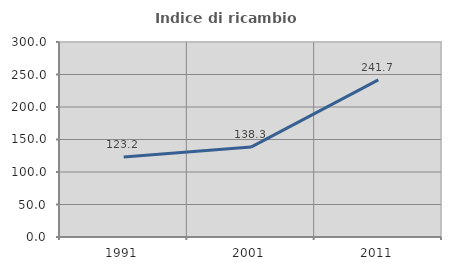
| Category | Indice di ricambio occupazionale  |
|---|---|
| 1991.0 | 123.221 |
| 2001.0 | 138.314 |
| 2011.0 | 241.667 |